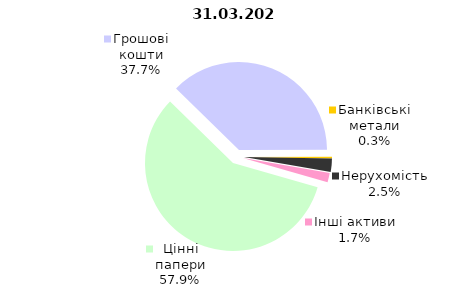
| Category | 31.03.2021 |
|---|---|
| Цінні папери | 2106.2 |
| Грошові кошти | 1370.49 |
| Банківські метали | 10.485 |
| Нерухомість | 90.355 |
| Інші активи | 62.073 |